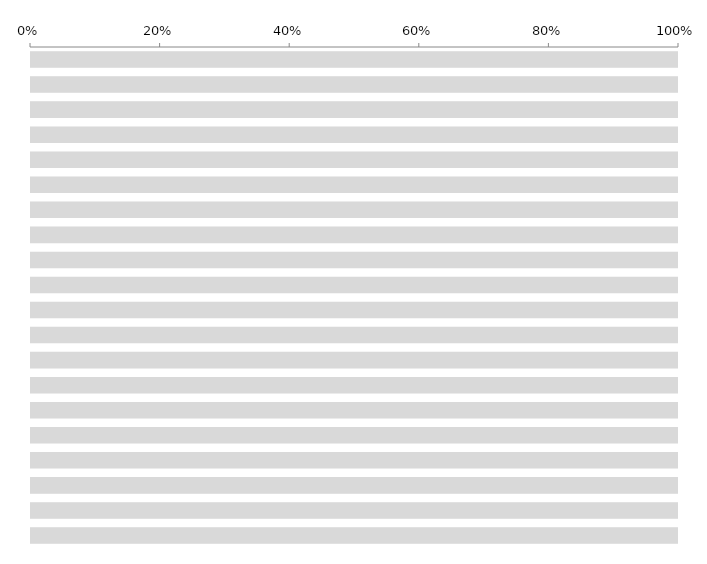
| Category | % Earned | % No | % Unanswered |
|---|---|---|---|
| PRODUCTION  | 0 | 0 | 1 |
| ACCOUNTING  | 0 | 0 | 1 |
| ART | 0 | 0 | 1 |
| ASSISTANT DIRECTORS | 0 | 0 | 1 |
| CAMERA | 0 | 0 | 1 |
| CATERING | 0 | 0 | 1 |
| CONSTRUCTION | 0 | 0 | 1 |
| COSTUME/WARDROBE | 0 | 0 | 1 |
| CRAFT SERVICE | 0 | 0 | 1 |
| ELECTRIC | 0 | 0 | 1 |
| GREEN | 0 | 0 | 1 |
| GRIP | 0 | 0 | 1 |
| HAIR | 0 | 0 | 1 |
| LOCATION | 0 | 0 | 1 |
| MAKE UP | 0 | 0 | 1 |
| PROP | 0 | 0 | 1 |
| SET DECORATION | 0 | 0 | 1 |
| SPECIAL EFFECTS | 0 | 0 | 1 |
| SOUND | 0 | 0 | 1 |
| TRANSPORTATION | 0 | 0 | 1 |